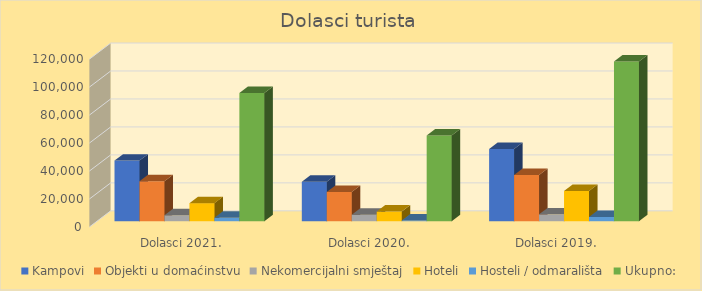
| Category | Kampovi | Objekti u domaćinstvu | Nekomercijalni smještaj | Hoteli | Hosteli / odmarališta | Ukupno: |
|---|---|---|---|---|---|---|
| Dolasci 2021. | 43354 | 28616 | 4272 | 12938 | 2439 | 91619 |
| Dolasci 2020. | 28224 | 20961 | 4717 | 6895 | 571 | 61368 |
| Dolasci 2019. | 51665 | 33035 | 4918 | 21637 | 3012 | 114267 |